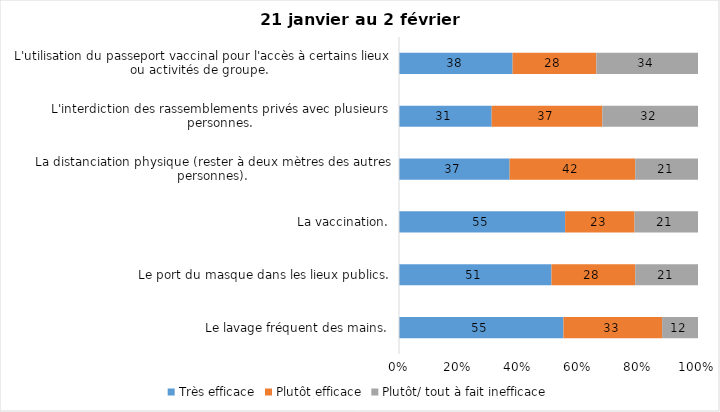
| Category | Très efficace | Plutôt efficace | Plutôt/ tout à fait inefficace |
|---|---|---|---|
| Le lavage fréquent des mains. | 55 | 33 | 12 |
| Le port du masque dans les lieux publics. | 51 | 28 | 21 |
| La vaccination. | 55 | 23 | 21 |
| La distanciation physique (rester à deux mètres des autres personnes). | 37 | 42 | 21 |
| L'interdiction des rassemblements privés avec plusieurs personnes. | 31 | 37 | 32 |
| L'utilisation du passeport vaccinal pour l'accès à certains lieux ou activités de groupe.  | 38 | 28 | 34 |